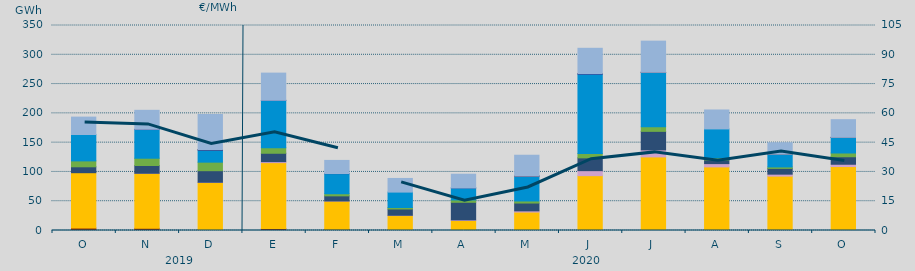
| Category | Carbón | Ciclo Combinado | Cogeneración | Consumo Bombeo | Eólica | Hidráulica | Nuclear | Solar fotovoltaica | Turbinación bombeo |
|---|---|---|---|---|---|---|---|---|---|
| O | 4163.7 | 94511.7 | 0 | 10093.2 | 10069.8 | 45049.8 | 0 | 0 | 29699 |
| N | 3677.8 | 93991.4 | 51.5 | 13298.4 | 12383 | 48971.8 | 539 | 0 | 32260 |
| D | 1607.3 | 80390.7 | 371.4 | 19733.1 | 14568.3 | 20541.3 | 876.4 | 1.2 | 60128.2 |
| E | 3376.2 | 112471.6 | 1718.3 | 14293.3 | 9539.1 | 80742.1 | 186 | 0 | 46371.3 |
| F | 1995 | 48257.3 | 169 | 8732.4 | 3606.8 | 34283.3 | 267 | 0 | 22347.8 |
| M | 418.1 | 25069.8 | 511.6 | 10680.8 | 2598.7 | 26299.3 | 0 | 0 | 23301.1 |
| A | 0 | 17020 | 1099 | 30032 | 4029 | 20482 | 12 | 0 | 23437 |
| M | 5 | 31454.1 | 2074.9 | 13342 | 3540.5 | 42478.4 | 139 | 1 | 35473.1 |
| J | 105 | 93533.6 | 8541.6 | 21857.1 | 7292.6 | 135598.7 | 1073 | 2 | 43074.4 |
| J | 50 | 125585.6 | 12039 | 31594.3 | 7693.1 | 93034.8 | 70 | 4 | 53243.2 |
| A | 0 | 108564.2 | 5645 | 6241.6 | 3597 | 49376 | 0 | 0 | 32334.2 |
| S | 50 | 92799.2 | 3342.1 | 9830.5 | 2500.3 | 21849.9 | 0 | 1 | 19451 |
| O | 3 | 109185.7 | 3918.6 | 12821.2 | 6372.3 | 26600.6 | 125 | 8 | 30188 |